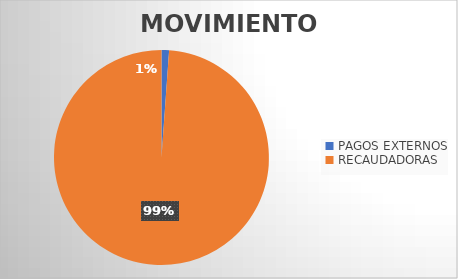
| Category | MOVIMIENTOS |
|---|---|
| PAGOS EXTERNOS | 264 |
| RECAUDADORAS | 23086 |